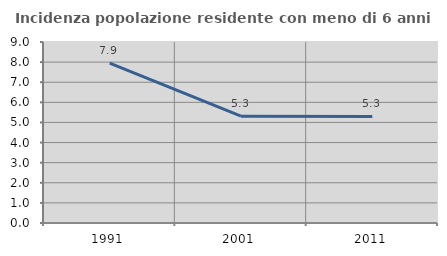
| Category | Incidenza popolazione residente con meno di 6 anni |
|---|---|
| 1991.0 | 7.944 |
| 2001.0 | 5.31 |
| 2011.0 | 5.3 |